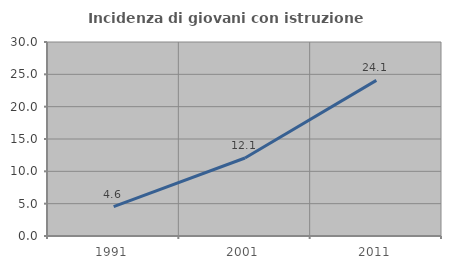
| Category | Incidenza di giovani con istruzione universitaria |
|---|---|
| 1991.0 | 4.552 |
| 2001.0 | 12.059 |
| 2011.0 | 24.071 |